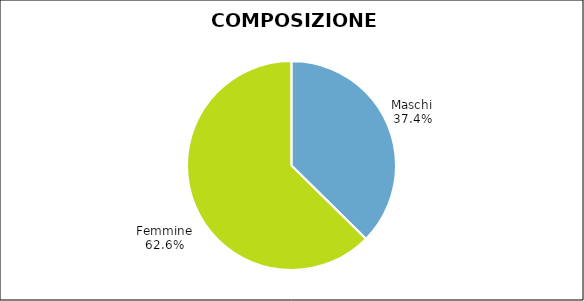
| Category | Series 0 |
|---|---|
| Maschi | 22383 |
| Femmine | 37497 |